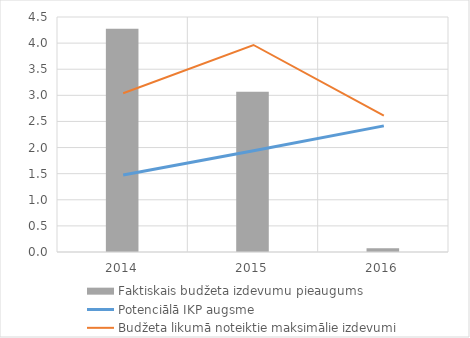
| Category | Faktiskais budžeta izdevumu pieaugums |
|---|---|
| 0 | 4.276 |
| 1 | 3.069 |
| 2 | 0.07 |